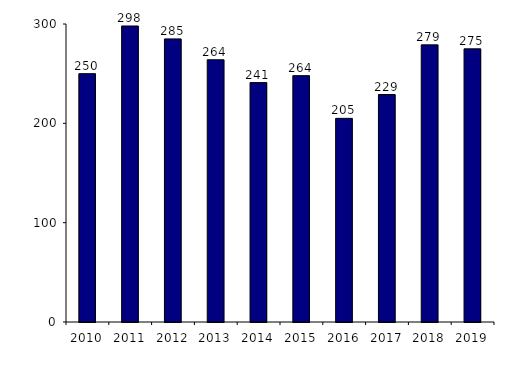
| Category | Nombre d'allogreffes |
|---|---|
| 2010.0 | 250 |
| 2011.0 | 298 |
| 2012.0 | 285 |
| 2013.0 | 264 |
| 2014.0 | 241 |
| 2015.0 | 248 |
| 2016.0 | 205 |
| 2017.0 | 229 |
| 2018.0 | 279 |
| 2019.0 | 275 |